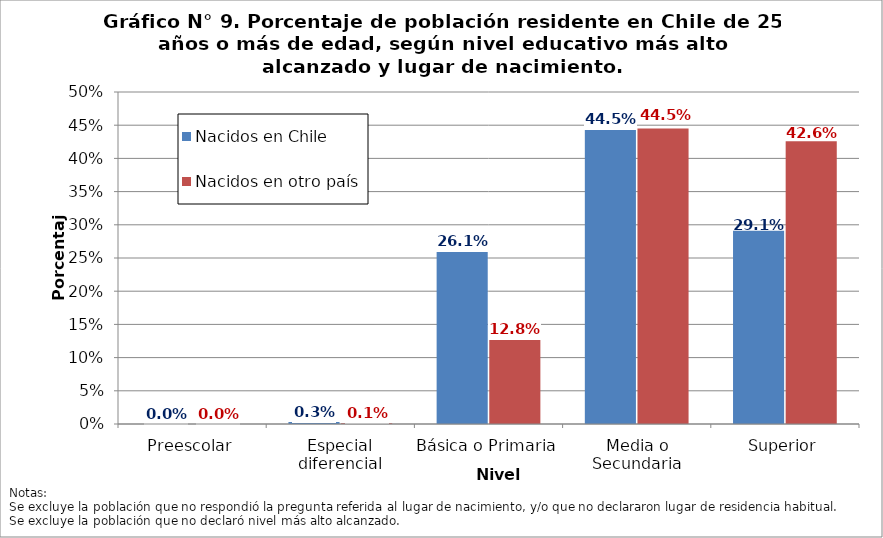
| Category | Nacidos en Chile | Nacidos en otro país |
|---|---|---|
| Preescolar | 0 | 0 |
| Especial diferencial | 0.003 | 0.001 |
| Básica o Primaria | 0.261 | 0.128 |
| Media o Secundaria | 0.445 | 0.445 |
| Superior | 0.291 | 0.426 |